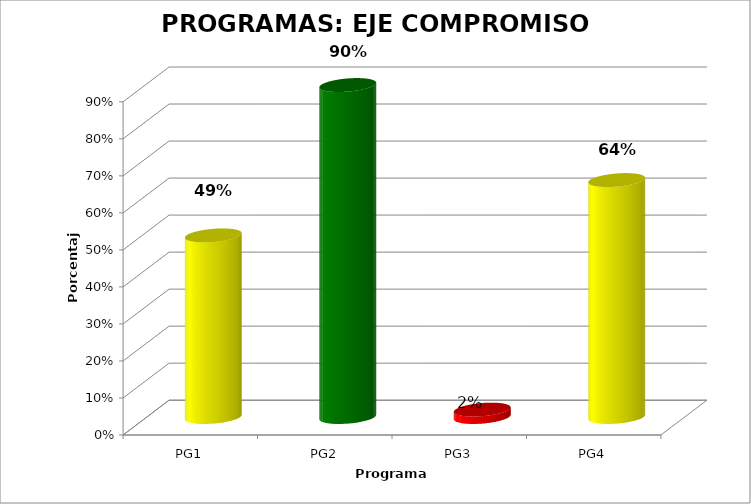
| Category | Series 0 |
|---|---|
| PG1 | 0.49 |
| PG2 | 0.897 |
| PG3 | 0.02 |
| PG4 | 0.64 |